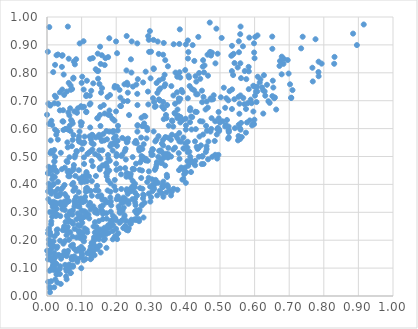
| Category | Series 0 |
|---|---|
| 0.06824700229965663 | 0.754 |
| 0.1830701874991575 | 0.353 |
| 0.2811772246203279 | 0.609 |
| 0.03949872893251938 | 0.336 |
| 0.013513308340486141 | 0.127 |
| 0.5805609430850153 | 0.691 |
| 0.2684255977533888 | 0.524 |
| 0.33551079434464426 | 0.56 |
| 0.4613237618124858 | 0.526 |
| 0.5594282554143306 | 0.596 |
| 0.015936230881952174 | 0.432 |
| 0.36609478913919913 | 0.384 |
| 0.005229981389317184 | 0.402 |
| 0.13617876414057561 | 0.211 |
| 0.0190204945127872 | 0.459 |
| 0.09884176475296524 | 0.408 |
| 0.31766599613850954 | 0.48 |
| 0.1120817068355886 | 0.374 |
| 0.3215266545365061 | 0.499 |
| 0.11395448531870145 | 0.299 |
| 0.6509886942930435 | 0.93 |
| 0.12961544246457035 | 0.412 |
| 0.25900898607874545 | 0.276 |
| 0.15515248873453558 | 0.156 |
| 0.15386628655129853 | 0.567 |
| 0.4067411714815298 | 0.516 |
| 0.09602220598651057 | 0.252 |
| 0.3145781405314173 | 0.459 |
| 0.19040139808495193 | 0.288 |
| 0.3007649762347038 | 0.876 |
| 0.7844956148613271 | 0.803 |
| 0.21088499514608583 | 0.302 |
| 0.012439027951619108 | 0.52 |
| 0.695639233063166 | 0.846 |
| 0.02204320124111081 | 0.214 |
| 0.19833497009324386 | 0.379 |
| 0.21177242997557244 | 0.681 |
| 0.05680670048457381 | 0.143 |
| 0.13990787974082763 | 0.379 |
| 0.06366160458976222 | 0.201 |
| 0.5548299941696926 | 0.874 |
| 0.6077482837482275 | 0.733 |
| 0.20954991679724588 | 0.739 |
| 0.43735292545906934 | 0.929 |
| 0.42852630509726297 | 0.66 |
| 0.5200988941397187 | 0.631 |
| 0.3361290591253796 | 0.41 |
| 0.3772609858993208 | 0.668 |
| 0.33561291336071164 | 0.696 |
| 0.22388247900074443 | 0.289 |
| 0.6308239940559905 | 0.718 |
| 0.16266515512876822 | 0.581 |
| 0.081697026464299 | 0.337 |
| 0.08227553829603818 | 0.338 |
| 0.1651942658163955 | 0.558 |
| 0.1716693177651626 | 0.222 |
| 0.15826200266414125 | 0.305 |
| 0.49590708330592104 | 0.66 |
| 0.5254547058298895 | 0.587 |
| 0.1611173163894316 | 0.295 |
| 0.18978728532721467 | 0.521 |
| 0.01963502204100509 | 0.401 |
| 0.022904042696837323 | 0.098 |
| 0.4133893953402268 | 0.623 |
| 0.057928287304938486 | 0.355 |
| 0.2516385949012927 | 0.454 |
| 0.3448040623651145 | 0.371 |
| 0.1067275963987685 | 0.196 |
| 0.011994217642718907 | 0.257 |
| 0.5993145377295892 | 0.751 |
| 0.17464963354633234 | 0.713 |
| 0.7389372572300447 | 0.929 |
| 0.15911428346599366 | 0.745 |
| 0.1725934173680994 | 0.429 |
| 0.2544721642553185 | 0.348 |
| 0.036999516548801514 | 0.097 |
| 0.10179420523171123 | 0.786 |
| 0.07244926398154428 | 0.265 |
| 0.5673173902346287 | 0.71 |
| 0.45378878852244087 | 0.801 |
| 0.09103132466671693 | 0.561 |
| 0.534562959266195 | 0.67 |
| 0.43149828598437356 | 0.769 |
| 0.5533381058271908 | 0.714 |
| 0.0747086994613474 | 0.307 |
| 0.2277823892010964 | 0.489 |
| 0.1077773991678479 | 0.41 |
| 0.2704978593562879 | 0.53 |
| 0.09052162772602856 | 0.234 |
| 0.1800290456814989 | 0.924 |
| 0.08971099720762388 | 0.254 |
| 0.8846224826055232 | 0.94 |
| 0.5343694973761695 | 0.806 |
| 0.45901625666952284 | 0.516 |
| 0.5394620513028953 | 0.868 |
| 0.12797463076417304 | 0.135 |
| 0.19582163611988468 | 0.416 |
| 0.18355029162093583 | 0.403 |
| 0.2613868529060491 | 0.684 |
| 0.0498611279947484 | 0.236 |
| 0.3958453580697351 | 0.528 |
| 0.060282389543253934 | 0.966 |
| 0.048222520248406564 | 0.794 |
| 0.4292675855977318 | 0.788 |
| 0.15023226838105275 | 0.216 |
| 0.12023103641395683 | 0.378 |
| 0.12225692437964863 | 0.515 |
| 0.1528545569412647 | 0.454 |
| 0.10164987374049583 | 0.676 |
| 0.1006480005140985 | 0.225 |
| 0.25097749966030447 | 0.397 |
| 0.22517596634446557 | 0.349 |
| 0.08195085373483468 | 0.43 |
| 0.5595049250783234 | 0.966 |
| 0.0722347280202481 | 0.626 |
| 0.039952407652258604 | 0.513 |
| 0.5986714847782346 | 0.873 |
| 0.26093512936785246 | 0.905 |
| 0.36125351934258054 | 0.629 |
| 0.5994043549654506 | 0.632 |
| 0.47131057100054474 | 0.875 |
| 0.008657417523353472 | 0.229 |
| 0.08507444343145498 | 0.21 |
| 0.10215245420312391 | 0.148 |
| 0.052686711993782165 | 0.599 |
| 0.22387320806887656 | 0.759 |
| 0.49955744955663617 | 0.622 |
| 0.31302371878940083 | 0.554 |
| 0.07933354990565844 | 0.142 |
| 0.5780549776932332 | 0.622 |
| 0.31160048101296645 | 0.678 |
| 0.19947959885254007 | 0.662 |
| 0.059561290878144546 | 0.445 |
| 0.38266058285021565 | 0.554 |
| 0.13564030322974407 | 0.202 |
| 0.06337578110452635 | 0.34 |
| 0.6785977842568344 | 0.858 |
| 0.18282876425494698 | 0.259 |
| 0.09395417792827299 | 0.589 |
| 0.3851879903616089 | 0.783 |
| 0.12557836676213385 | 0.69 |
| 0.43901208126293734 | 0.499 |
| 0.43537456775125893 | 0.723 |
| 0.21763980230334345 | 0.567 |
| 0.4523501550121589 | 0.713 |
| 0.16677073158493105 | 0.654 |
| 0.010764543044459063 | 0.558 |
| 0.22185866546062727 | 0.317 |
| 0.16133503638913416 | 0.324 |
| 0.19207148982297495 | 0.545 |
| 0.3418346939650596 | 0.759 |
| 0.20474861560081747 | 0.352 |
| 0.4284052369014043 | 0.485 |
| 0.029587092239071078 | 0.29 |
| 0.08188166345749015 | 0.505 |
| 0.16893505166892464 | 0.852 |
| 0.46488136141790926 | 0.675 |
| 0.008191597259982197 | 0.301 |
| 0.01899270890311089 | 0.106 |
| 0.45253487404511084 | 0.473 |
| 0.02891332274455871 | 0.224 |
| 0.5564487210250814 | 0.689 |
| 0.0968394567399109 | 0.342 |
| 0.028604775995269116 | 0.445 |
| 0.4253869010413215 | 0.737 |
| 0.28899921892057656 | 0.603 |
| 0.6090662876008548 | 0.786 |
| 0.02348424862243148 | 0.373 |
| 0.3385578229192113 | 0.506 |
| 0.455272377834505 | 0.826 |
| 0.039753670062191215 | 0.043 |
| 0.3136725323834063 | 0.408 |
| 0.5576511713963256 | 0.601 |
| 0.21126848088696926 | 0.457 |
| 0.3999139699988784 | 0.547 |
| 0.11310617071994966 | 0.716 |
| 0.399424643162948 | 0.81 |
| 0.04754799831796763 | 0.595 |
| 0.07149349742037692 | 0.133 |
| 0.038590806049310866 | 0.286 |
| 0.105588915844957 | 0.913 |
| 0.19521631159899244 | 0.747 |
| 0.20264341385494578 | 0.204 |
| 0.4977189184482712 | 0.591 |
| 0.39430797097548254 | 0.529 |
| 0.3611563411412537 | 0.578 |
| 0.18427706475229055 | 0.302 |
| 0.00015083269038240754 | 0.65 |
| 0.100773571525555 | 0.526 |
| 0.023310899792571282 | 0.596 |
| 0.09743799858089441 | 0.623 |
| 0.33531689206058213 | 0.391 |
| 0.07579187833100598 | 0.405 |
| 0.10198308516575605 | 0.278 |
| 0.5023664171913251 | 0.712 |
| 0.29802936256956225 | 0.392 |
| 0.10188896735229902 | 0.262 |
| 0.3451839161553236 | 0.51 |
| 0.0839099567654632 | 0.355 |
| 0.3242516531566456 | 0.773 |
| 0.3713653593978169 | 0.801 |
| 0.2004183331914342 | 0.217 |
| 0.10864978334318542 | 0.242 |
| 0.22049944693537582 | 0.244 |
| 0.32837936434123793 | 0.522 |
| 0.7850043519947243 | 0.84 |
| 0.15456722828429692 | 0.609 |
| 0.17513754700077733 | 0.451 |
| 0.12625219152828748 | 0.177 |
| 0.1408123842131923 | 0.813 |
| 0.4177013598127346 | 0.597 |
| 0.051374447865876305 | 0.325 |
| 0.138693052904036 | 0.3 |
| 0.05241586046878244 | 0.112 |
| 0.45988037742373244 | 0.61 |
| 0.5887203780079965 | 0.704 |
| 0.03243879844314068 | 0.332 |
| 0.22495912557318254 | 0.52 |
| 0.03172090971301067 | 0.866 |
| 0.04407960424496371 | 0.312 |
| 0.09236744571664901 | 0.572 |
| 0.6012244147038303 | 0.718 |
| 0.2593885608527896 | 0.307 |
| 0.14464719484505184 | 0.226 |
| 0.025976558038393383 | 0.713 |
| 0.13814014786351858 | 0.228 |
| 0.15707125635043817 | 0.355 |
| 0.5149372932353731 | 0.608 |
| 0.2603279560010002 | 0.36 |
| 0.28550728990628216 | 0.486 |
| 0.36536572617085405 | 0.719 |
| 0.007456008931928437 | 0.091 |
| 0.524980920690974 | 0.607 |
| 0.68339337696201 | 0.832 |
| 0.11396330192383275 | 0.444 |
| 0.7059644916804282 | 0.711 |
| 0.01610166321873696 | 0.328 |
| 0.2794426743781543 | 0.544 |
| 0.3879050370181828 | 0.46 |
| 0.5166995588680161 | 0.613 |
| 0.09700886651577612 | 0.349 |
| 0.09649383480118745 | 0.336 |
| 0.26123678799216565 | 0.589 |
| 0.06142903245437226 | 0.097 |
| 0.19455641725190587 | 0.275 |
| 0.06490385740716309 | 0.497 |
| 0.025627231822067165 | 0.334 |
| 0.5982873693957241 | 0.906 |
| 0.10260330267287454 | 0.281 |
| 0.2007952117442966 | 0.452 |
| 0.5962529507768168 | 0.754 |
| 0.2746921873243755 | 0.45 |
| 0.3966207150986327 | 0.45 |
| 0.1479925997104251 | 0.807 |
| 0.08668452060249765 | 0.657 |
| 0.10054907192700024 | 0.621 |
| 0.007945434103223792 | 0.033 |
| 0.5430544450167653 | 0.601 |
| 0.358651507864568 | 0.5 |
| 0.46546816528288415 | 0.49 |
| 0.44939869877589567 | 0.626 |
| 0.09956102745817486 | 0.206 |
| 0.1706379066424769 | 0.24 |
| 0.3470085527237151 | 0.684 |
| 0.3821579215872045 | 0.584 |
| 0.24088242842353413 | 0.432 |
| 0.332693939597962 | 0.679 |
| 0.127844367565232 | 0.736 |
| 0.16045897605840875 | 0.468 |
| 0.4084803926927424 | 0.874 |
| 0.1124764320729097 | 0.385 |
| 0.38381147055337317 | 0.956 |
| 0.10868055400388188 | 0.571 |
| 0.1258490187155512 | 0.132 |
| 0.0763758061290678 | 0.782 |
| 0.2533103756338395 | 0.55 |
| 0.29433643464734605 | 0.447 |
| 0.09311993776528649 | 0.321 |
| 0.10012812378704461 | 0.764 |
| 0.0031068490973011897 | 0.225 |
| 0.0235377776839083 | 0.323 |
| 0.29939992164804674 | 0.78 |
| 0.4477658637585452 | 0.736 |
| 0.22776353692757445 | 0.56 |
| 0.03913271862962997 | 0.366 |
| 0.2176906132737506 | 0.507 |
| 0.4776344737603444 | 0.499 |
| 0.6017582924854767 | 0.929 |
| 0.10359587740583087 | 0.226 |
| 0.36994888372674783 | 0.532 |
| 0.41426557344322756 | 0.673 |
| 0.14371135482239483 | 0.211 |
| 0.1466645407451137 | 0.637 |
| 0.06184871662531255 | 0.429 |
| 0.6846558682056726 | 0.85 |
| 0.0024561856715252794 | 0.876 |
| 0.22951050618111868 | 0.428 |
| 0.5980340544633178 | 0.615 |
| 0.1514666868333403 | 0.76 |
| 0.24189531331506664 | 0.438 |
| 0.20728023557017317 | 0.321 |
| 0.16397963124206105 | 0.684 |
| 0.2302396516940134 | 0.932 |
| 0.10518077826250782 | 0.2 |
| 0.2537186246725601 | 0.275 |
| 0.3298587975887284 | 0.477 |
| 0.01935766864990318 | 0.338 |
| 0.16714402956891505 | 0.205 |
| 0.19956558787444822 | 0.241 |
| 0.48615189162647743 | 0.506 |
| 0.06979664603456215 | 0.446 |
| 0.0005221446316013845 | 0.162 |
| 0.36854589580299735 | 0.656 |
| 0.14187036576598344 | 0.307 |
| 0.3043711683179695 | 0.526 |
| 0.32952042391439573 | 0.49 |
| 0.35016626725264965 | 0.567 |
| 0.035518257940128084 | 0.145 |
| 0.26638292682701503 | 0.304 |
| 0.44707467850547156 | 0.473 |
| 0.3166496488346561 | 0.561 |
| 0.41049776200239596 | 0.783 |
| 0.4011532822886341 | 0.596 |
| 0.06894336729470651 | 0.739 |
| 0.3581765977727377 | 0.56 |
| 0.13370198527782917 | 0.189 |
| 0.40184390029761774 | 0.444 |
| 0.0214273757786948 | 0.325 |
| 0.17179900955451954 | 0.173 |
| 0.3345979606999473 | 0.399 |
| 0.04420362903426944 | 0.74 |
| 0.67825689687413 | 0.795 |
| 0.07404300865532765 | 0.559 |
| 0.49206085800489885 | 0.598 |
| 0.277538639799373 | 0.35 |
| 0.021348786034781853 | 0.482 |
| 0.46401071887073175 | 0.865 |
| 0.06076338868550113 | 0.226 |
| 0.06456800272598151 | 0.113 |
| 0.34158595023806015 | 0.468 |
| 0.062194310552669 | 0.446 |
| 0.029909297944114344 | 0.048 |
| 0.49405151160351324 | 0.602 |
| 0.03785800105482129 | 0.107 |
| 0.20991870455833783 | 0.262 |
| 0.12851986443594943 | 0.144 |
| 0.0026931499207359932 | 0.441 |
| 0.09911168209205978 | 0.155 |
| 0.24751972419775403 | 0.384 |
| 0.06008998250053377 | 0.096 |
| 0.24704568796503146 | 0.347 |
| 0.27546973769783467 | 0.527 |
| 0.8309813367402479 | 0.857 |
| 0.05008178690281717 | 0.244 |
| 0.020733462822632 | 0.155 |
| 0.14536286523457542 | 0.169 |
| 0.5926269037526801 | 0.612 |
| 0.32402819063869415 | 0.739 |
| 0.15406710534095513 | 0.218 |
| 0.15675400401415884 | 0.31 |
| 0.08887543595851544 | 0.296 |
| 0.2008596654694932 | 0.509 |
| 0.30978636503811385 | 0.384 |
| 0.12434600277579055 | 0.334 |
| 0.18905073761233526 | 0.273 |
| 0.47405759991254603 | 0.862 |
| 0.04598442529145763 | 0.145 |
| 0.051423476318921635 | 0.46 |
| 0.12428112790544465 | 0.165 |
| 0.2296594886630069 | 0.808 |
| 0.04711064592956815 | 0.625 |
| 0.4281839401443912 | 0.469 |
| 0.5628748999451171 | 0.57 |
| 0.24481958493987432 | 0.912 |
| 0.04655570352494176 | 0.666 |
| 0.22391799397048617 | 0.285 |
| 0.27898806200563353 | 0.281 |
| 0.09327594198008726 | 0.421 |
| 0.3085690890782641 | 0.813 |
| 0.021964676339643496 | 0.301 |
| 0.24902774060201738 | 0.456 |
| 0.18917037596670616 | 0.635 |
| 0.10767774915973705 | 0.55 |
| 0.33502949826721184 | 0.779 |
| 0.08480545934062989 | 0.274 |
| 0.35936065806220296 | 0.752 |
| 0.094465270451903 | 0.905 |
| 0.06088116862142112 | 0.162 |
| 0.1099880287148064 | 0.341 |
| 0.1345935463294573 | 0.249 |
| 0.5419215696697052 | 0.835 |
| 0.4384438992531987 | 0.532 |
| 0.5608731136048677 | 0.62 |
| 0.0214341786565162 | 0.482 |
| 0.33154660463507113 | 0.369 |
| 0.14982929462450512 | 0.269 |
| 0.3275811350309321 | 0.744 |
| 0.3422299145967581 | 0.57 |
| 0.20522873618853177 | 0.348 |
| 0.022467073643641533 | 0.426 |
| 0.015734358819027294 | 0.103 |
| 0.04948246525526456 | 0.721 |
| 0.49743920369111616 | 0.597 |
| 0.06693399942021605 | 0.673 |
| 0.2528798236409415 | 0.273 |
| 0.07552973792330031 | 0.132 |
| 0.027274209104811487 | 0.078 |
| 0.07154820835942133 | 0.131 |
| 0.031181623376824397 | 0.383 |
| 0.5847204478045978 | 0.926 |
| 0.3830215471682241 | 0.802 |
| 0.03173951309323686 | 0.409 |
| 0.37644700463962155 | 0.786 |
| 0.13127257731508568 | 0.525 |
| 0.10327637385962662 | 0.303 |
| 0.5827683786903678 | 0.821 |
| 0.0680782518023687 | 0.591 |
| 0.514956625236158 | 0.674 |
| 0.08087883586635536 | 0.33 |
| 0.09966332342558237 | 0.307 |
| 0.02793475640227039 | 0.172 |
| 0.04561192849789386 | 0.236 |
| 0.2257829158366762 | 0.251 |
| 0.27382558096476006 | 0.325 |
| 0.3417794968610596 | 0.845 |
| 0.16021014901131336 | 0.303 |
| 0.3772278614906026 | 0.565 |
| 0.1552276265090502 | 0.832 |
| 0.13257389844062362 | 0.154 |
| 0.09824141993186408 | 0.68 |
| 0.11180056713312214 | 0.285 |
| 0.34623423477970594 | 0.434 |
| 0.29016367532146603 | 0.594 |
| 0.06331311600577216 | 0.448 |
| 0.12204582246893192 | 0.278 |
| 0.6358004572582457 | 0.757 |
| 0.07547756536742634 | 0.105 |
| 0.47670746466215663 | 0.872 |
| 0.11124854984476107 | 0.133 |
| 0.2573508667332457 | 0.474 |
| 0.349701449662549 | 0.392 |
| 0.05886799661068942 | 0.551 |
| 0.19867625633845531 | 0.208 |
| 0.026389370524434352 | 0.116 |
| 0.14141160001452624 | 0.568 |
| 0.23555618908692688 | 0.34 |
| 0.07261380233164971 | 0.4 |
| 0.009967958485296635 | 0.337 |
| 0.1385084942022432 | 0.265 |
| 0.318958562432028 | 0.728 |
| 0.024051265069297112 | 0.059 |
| 0.057278542631441054 | 0.733 |
| 0.18563099186146215 | 0.546 |
| 0.0498879297519379 | 0.338 |
| 0.15853503926999968 | 0.863 |
| 0.3830161462529452 | 0.492 |
| 0.0914914780008047 | 0.372 |
| 0.025737821346734968 | 0.287 |
| 0.9154318183329784 | 0.973 |
| 0.007868275587523232 | 0.388 |
| 0.4616398535826288 | 0.697 |
| 0.26894833478779867 | 0.387 |
| 0.10726353643271247 | 0.473 |
| 0.48607397839713595 | 0.626 |
| 0.12337040799916077 | 0.686 |
| 0.1844949667906458 | 0.339 |
| 0.09196609897743324 | 0.451 |
| 0.5414833811156791 | 0.705 |
| 0.1772993676231127 | 0.493 |
| 0.17630422463504847 | 0.245 |
| 0.3494571926993034 | 0.823 |
| 0.291782708598735 | 0.733 |
| 0.058350896950246534 | 0.336 |
| 0.027958175857930034 | 0.292 |
| 0.43535643009607916 | 0.527 |
| 0.100916916808105 | 0.347 |
| 0.1716936961889557 | 0.591 |
| 0.17268797943185188 | 0.464 |
| 0.2936919509053666 | 0.423 |
| 0.23907029736844698 | 0.382 |
| 0.10577779683375033 | 0.547 |
| 0.34550644097971606 | 0.637 |
| 0.5540321956184917 | 0.614 |
| 0.3329584206242001 | 0.515 |
| 0.5760485395886668 | 0.777 |
| 0.13369240474354627 | 0.762 |
| 0.020810776389173835 | 0.523 |
| 0.1059409866392389 | 0.415 |
| 0.7344945650486575 | 0.888 |
| 0.38521214891860844 | 0.622 |
| 0.2821174989940023 | 0.334 |
| 0.04344654218828625 | 0.861 |
| 0.07929466408040209 | 0.321 |
| 0.09868105014095552 | 0.176 |
| 0.0039430406412531704 | 0.347 |
| 0.18272812036489783 | 0.537 |
| 0.0646066320385571 | 0.648 |
| 0.12472691632333 | 0.85 |
| 0.08911375123089715 | 0.164 |
| 0.07679867570478449 | 0.458 |
| 0.1414616469335378 | 0.43 |
| 0.23024393160391055 | 0.44 |
| 0.29139589714281877 | 0.485 |
| 0.5715697852397332 | 0.806 |
| 0.4664030626083471 | 0.554 |
| 0.2624980814578475 | 0.777 |
| 0.10176315920961532 | 0.344 |
| 0.19612621763513471 | 0.753 |
| 0.2183251942880312 | 0.306 |
| 0.4091790205317738 | 0.79 |
| 0.1323994259462533 | 0.466 |
| 0.15272163519031134 | 0.181 |
| 0.5183808677257425 | 0.709 |
| 0.4119604851892895 | 0.477 |
| 0.27599031839925336 | 0.384 |
| 0.09169543702215388 | 0.28 |
| 0.33181122647270866 | 0.547 |
| 0.21483102819230449 | 0.269 |
| 0.01565613779950703 | 0.451 |
| 0.5237506437463733 | 0.564 |
| 0.0034811446033661264 | 0.44 |
| 0.27311053086530024 | 0.502 |
| 0.23285846053293568 | 0.699 |
| 0.25685930615861785 | 0.556 |
| 0.3076800192921697 | 0.918 |
| 0.38077548513717674 | 0.512 |
| 0.21403530504474388 | 0.436 |
| 0.2544953525044762 | 0.37 |
| 0.1818900357655927 | 0.246 |
| 0.31675139840754607 | 0.763 |
| 0.06471028043907989 | 0.295 |
| 0.21040055523338985 | 0.298 |
| 0.10751985336255743 | 0.211 |
| 0.1530776563151227 | 0.649 |
| 0.1198116924309427 | 0.291 |
| 0.5379316029011697 | 0.792 |
| 0.028134150233110056 | 0.236 |
| 0.30957357164149657 | 0.695 |
| 0.011910800227780571 | 0.169 |
| 0.231198589605619 | 0.376 |
| 0.06941047322986149 | 0.18 |
| 0.0500222621602846 | 0.16 |
| 0.3919369724065328 | 0.73 |
| 0.33708874394628496 | 0.495 |
| 0.37710796800114066 | 0.381 |
| 0.6586866287487936 | 0.712 |
| 0.22066103257837255 | 0.353 |
| 0.15471413896127872 | 0.678 |
| 0.28433600155455563 | 0.488 |
| 0.24288590246328434 | 0.268 |
| 0.12911507156396862 | 0.484 |
| 0.44921017236737826 | 0.5 |
| 0.22725198445687134 | 0.527 |
| 0.3053614696512258 | 0.506 |
| 0.2682037498271339 | 0.531 |
| 0.1803583526090845 | 0.665 |
| 0.047304202800513284 | 0.188 |
| 0.13676877233128004 | 0.166 |
| 0.2721824443473564 | 0.568 |
| 0.23718462793031447 | 0.649 |
| 0.33743812576041443 | 0.907 |
| 0.19992651391557692 | 0.474 |
| 0.12388781889236067 | 0.159 |
| 0.14501658819315077 | 0.241 |
| 0.32576294320125454 | 0.377 |
| 0.013802153840372311 | 0.179 |
| 0.1545105444834065 | 0.493 |
| 0.004047374524346559 | 0.236 |
| 0.39647524511812493 | 0.436 |
| 0.14468354654259352 | 0.395 |
| 0.022683513377483533 | 0.718 |
| 0.006635736686724569 | 0.964 |
| 0.059783449213340556 | 0.248 |
| 0.5582159599155873 | 0.563 |
| 0.2167953666035194 | 0.34 |
| 0.09935217093802184 | 0.14 |
| 0.2341858910765735 | 0.235 |
| 0.3230143734346266 | 0.868 |
| 0.28757194512961515 | 0.565 |
| 0.06862468836224778 | 0.083 |
| 0.40153497719850617 | 0.612 |
| 0.2950996329197566 | 0.875 |
| 0.19487341071979702 | 0.549 |
| 0.23328621070781264 | 0.366 |
| 0.5859120053884752 | 0.629 |
| 0.06689116331385403 | 0.297 |
| 0.17064495034909355 | 0.335 |
| 0.00951996204613248 | 0.683 |
| 0.6248354889637765 | 0.737 |
| 0.011826564668535045 | 0.377 |
| 0.1766581696274253 | 0.856 |
| 0.05998757485913098 | 0.533 |
| 0.4257942793691921 | 0.843 |
| 0.13976744751058656 | 0.309 |
| 0.17996761748952372 | 0.45 |
| 0.38869974324463985 | 0.739 |
| 0.11169435166419939 | 0.427 |
| 0.27957372192445995 | 0.361 |
| 0.40680992400917704 | 0.553 |
| 0.48680685857908546 | 0.834 |
| 0.31390145751464993 | 0.416 |
| 0.5913342961932558 | 0.691 |
| 0.019299126523410814 | 0.179 |
| 0.17136673478074682 | 0.441 |
| 0.41867245778542084 | 0.742 |
| 0.037310201416982824 | 0.73 |
| 0.709491932647244 | 0.738 |
| 0.20445989045258894 | 0.593 |
| 0.05499144936682887 | 0.097 |
| 0.05525902003247807 | 0.07 |
| 0.23551361083177458 | 0.331 |
| 0.09647144610316405 | 0.229 |
| 0.3363466821359917 | 0.356 |
| 0.0864203062579304 | 0.518 |
| 0.015096874717155706 | 0.419 |
| 0.48960452891435613 | 0.958 |
| 0.3469916985228245 | 0.426 |
| 0.1486706991115362 | 0.377 |
| 0.1489324235364209 | 0.502 |
| 0.07496767450415565 | 0.109 |
| 0.04542809820466975 | 0.389 |
| 0.1857376791678803 | 0.325 |
| 0.6149847843756306 | 0.766 |
| 0.13418226857740823 | 0.183 |
| 0.2559175303872715 | 0.326 |
| 0.07767097627139086 | 0.469 |
| 0.21855088385389254 | 0.273 |
| 0.5607644739859561 | 0.781 |
| 0.43264667266681556 | 0.534 |
| 0.4301609819668881 | 0.598 |
| 0.11388577528548915 | 0.661 |
| 0.2582407384276413 | 0.758 |
| 0.13757982047569317 | 0.146 |
| 0.1717635613322146 | 0.475 |
| 0.06325784355363107 | 0.441 |
| 0.10355121538877676 | 0.428 |
| 0.3438429746745072 | 0.649 |
| 0.3356437499703874 | 0.865 |
| 0.07189554837346124 | 0.537 |
| 0.04085322536402303 | 0.134 |
| 0.018461695557840163 | 0.12 |
| 0.32396628128093785 | 0.52 |
| 0.06727188366649528 | 0.229 |
| 0.1288970312031329 | 0.549 |
| 0.3475870909328399 | 0.398 |
| 0.37582206715468114 | 0.73 |
| 0.4406789350492373 | 0.572 |
| 0.14338554005017057 | 0.248 |
| 0.6568229523158794 | 0.709 |
| 0.18749142124893314 | 0.266 |
| 0.6525513685943345 | 0.772 |
| 0.014939214548216784 | 0.284 |
| 0.19032412686366307 | 0.588 |
| 0.037188545389090444 | 0.079 |
| 0.43966121199286046 | 0.799 |
| 0.013223560122144984 | 0.136 |
| 0.2335949184772078 | 0.729 |
| 0.48177378288796535 | 0.719 |
| 0.7760380129409502 | 0.92 |
| 0.07259691986464367 | 0.742 |
| 0.07088076504475604 | 0.303 |
| 0.05917925648787348 | 0.48 |
| 0.16274696206204642 | 0.228 |
| 0.07507864608686965 | 0.184 |
| 0.26547160395638025 | 0.276 |
| 0.5591888757650515 | 0.719 |
| 0.015713070559850717 | 0.397 |
| 0.2852138220352213 | 0.804 |
| 0.5275558443348123 | 0.734 |
| 0.17882306898914868 | 0.227 |
| 0.2546144200827962 | 0.304 |
| 0.17817912348910048 | 0.336 |
| 0.02755828919757075 | 0.312 |
| 0.5999196706433922 | 0.852 |
| 0.5048430959085087 | 0.925 |
| 0.1763444150993102 | 0.253 |
| 0.4430042973804761 | 0.778 |
| 0.3651385194563691 | 0.525 |
| 0.1751211680201339 | 0.378 |
| 0.05926422744443405 | 0.282 |
| 0.35360612983649276 | 0.378 |
| 0.14282404270386018 | 0.177 |
| 0.11670225993360284 | 0.509 |
| 0.08046693457308618 | 0.345 |
| 0.03000919041408856 | 0.177 |
| 0.39869460249217015 | 0.46 |
| 0.03123795178603761 | 0.358 |
| 0.10690223394578557 | 0.497 |
| 0.05625920672563256 | 0.599 |
| 0.005744502786495964 | 0.187 |
| 0.18433577328470518 | 0.269 |
| 0.08104713235874916 | 0.338 |
| 0.1147878062293628 | 0.237 |
| 0.4723960913901918 | 0.589 |
| 0.3200315332343213 | 0.912 |
| 0.24396308860114124 | 0.273 |
| 0.12163460244710878 | 0.428 |
| 0.09267455286086712 | 0.553 |
| 0.1916204603513928 | 0.591 |
| 0.17701932961649758 | 0.65 |
| 0.11439076589742025 | 0.721 |
| 0.17383973901181105 | 0.44 |
| 0.4069663974920924 | 0.916 |
| 0.4610893804965981 | 0.537 |
| 0.18343087651985135 | 0.374 |
| 0.19979898416613173 | 0.272 |
| 0.05159112007833089 | 0.308 |
| 0.2011104062783351 | 0.347 |
| 0.15981792358589475 | 0.345 |
| 0.3505546842504732 | 0.531 |
| 0.2660341296578804 | 0.268 |
| 0.507097076701096 | 0.626 |
| 0.8956449033073955 | 0.899 |
| 0.0032001121327925874 | 0.375 |
| 0.0158574833074413 | 0.512 |
| 0.15115512469248693 | 0.522 |
| 0.14664363749790954 | 0.869 |
| 0.27564627281230325 | 0.328 |
| 0.37969936713140373 | 0.646 |
| 0.17345491357739262 | 0.562 |
| 0.2123258158121133 | 0.711 |
| 0.2784373079538711 | 0.497 |
| 0.19848195120524748 | 0.573 |
| 0.2660772375082816 | 0.527 |
| 0.1295595755126706 | 0.359 |
| 0.028501694429239555 | 0.091 |
| 0.38157592520635375 | 0.451 |
| 0.05660193517843248 | 0.483 |
| 0.2023178417793009 | 0.538 |
| 0.19598203974675354 | 0.213 |
| 0.17251163468331832 | 0.277 |
| 0.01188132101868311 | 0.053 |
| 0.5964475017861324 | 0.661 |
| 0.24068194637836726 | 0.425 |
| 0.2587821286447952 | 0.273 |
| 0.061601289116898994 | 0.658 |
| 0.25428061422996984 | 0.402 |
| 0.49312086482326467 | 0.868 |
| 0.0061489214828419625 | 0.242 |
| 0.37656614012973677 | 0.638 |
| 0.15685821371650233 | 0.361 |
| 0.534932096139213 | 0.863 |
| 0.15342930351835438 | 0.894 |
| 0.2723053094410429 | 0.423 |
| 0.15056727516878 | 0.578 |
| 0.09420536789976586 | 0.209 |
| 0.010298048197590948 | 0.219 |
| 0.15502676495934897 | 0.32 |
| 0.04086483046327527 | 0.382 |
| 0.1346703105797833 | 0.544 |
| 0.037787274772626445 | 0.198 |
| 0.009229136923756598 | 0.153 |
| 0.1452605127621518 | 0.807 |
| 0.30211004409644493 | 0.506 |
| 0.06974733082565754 | 0.631 |
| 0.33300383366866737 | 0.392 |
| 0.5240885991230054 | 0.701 |
| 0.2615407977026625 | 0.611 |
| 0.43129092850042505 | 0.723 |
| 0.0665427896239652 | 0.302 |
| 0.22800051540892152 | 0.27 |
| 0.06836773985011813 | 0.295 |
| 0.08958181888564687 | 0.132 |
| 0.3063389722342311 | 0.525 |
| 0.10603080131410625 | 0.74 |
| 0.5588526320478862 | 0.834 |
| 0.4848162256733968 | 0.556 |
| 0.4013187023331053 | 0.406 |
| 0.14520337487157386 | 0.296 |
| 0.554365087246432 | 0.913 |
| 0.4196806968225034 | 0.641 |
| 0.1477466479115479 | 0.779 |
| 0.12015090468589351 | 0.325 |
| 0.11532227043640586 | 0.772 |
| 0.06565413235450224 | 0.429 |
| 0.2025517482420317 | 0.87 |
| 0.13404282607450413 | 0.321 |
| 0.21470398491366338 | 0.383 |
| 0.23419791339952079 | 0.564 |
| 0.6398881252680367 | 0.698 |
| 0.03140519152981691 | 0.561 |
| 0.4115557794191931 | 0.517 |
| 0.12280973719954402 | 0.572 |
| 0.5750249744277235 | 0.585 |
| 0.24764648073416928 | 0.456 |
| 0.552092751424578 | 0.558 |
| 0.1523468439432567 | 0.46 |
| 0.004228010709672603 | 0.148 |
| 0.4449228290638154 | 0.54 |
| 0.3263935917077754 | 0.701 |
| 0.7937516473710551 | 0.833 |
| 0.11018510101341539 | 0.355 |
| 0.5511748693232964 | 0.819 |
| 0.4953787334404163 | 0.506 |
| 0.22722255518012624 | 0.249 |
| 0.6983299580631945 | 0.797 |
| 0.2927987346655432 | 0.687 |
| 0.49074148452611854 | 0.579 |
| 0.5706024436779166 | 0.688 |
| 0.4071142609354521 | 0.709 |
| 0.1660754909495038 | 0.245 |
| 0.21523449011495477 | 0.501 |
| 0.10459924455390113 | 0.168 |
| 0.23637626323344507 | 0.242 |
| 0.1971016839315748 | 0.279 |
| 0.07645070232848783 | 0.453 |
| 0.023657246926638398 | 0.138 |
| 0.06574899489741359 | 0.269 |
| 0.17075079719713226 | 0.468 |
| 0.3604846160041627 | 0.374 |
| 0.5346214088290738 | 0.897 |
| 0.24758786836360336 | 0.498 |
| 0.3207940103979693 | 0.406 |
| 0.029376814578881638 | 0.589 |
| 0.20601157993274855 | 0.225 |
| 0.08472431515493783 | 0.162 |
| 0.04485619562607257 | 0.626 |
| 0.5349209186342229 | 0.741 |
| 0.12383804065631188 | 0.718 |
| 0.3506765506084236 | 0.508 |
| 0.0449754889977948 | 0.863 |
| 0.06278397877663278 | 0.85 |
| 0.12863347164586136 | 0.19 |
| 0.5251095133501468 | 0.592 |
| 0.24270243709347872 | 0.376 |
| 0.2425212689493681 | 0.259 |
| 0.2755479595087629 | 0.609 |
| 0.2674320096041548 | 0.309 |
| 0.2778846699283706 | 0.765 |
| 0.30463984087833307 | 0.375 |
| 0.08057287210512476 | 0.83 |
| 0.07969164249666816 | 0.24 |
| 0.017472280805968632 | 0.111 |
| 0.6735242052222802 | 0.842 |
| 0.38076930505829 | 0.697 |
| 0.6215083505623901 | 0.748 |
| 0.28075960533948074 | 0.618 |
| 0.03317273926616959 | 0.147 |
| 0.10216310965512898 | 0.21 |
| 0.1609576385934819 | 0.217 |
| 0.025852704079869615 | 0.45 |
| 0.12339419088839043 | 0.152 |
| 0.7850624472604246 | 0.788 |
| 0.3012060263918783 | 0.515 |
| 0.45112550114189287 | 0.845 |
| 0.2593817940402844 | 0.547 |
| 0.5560103447679171 | 0.653 |
| 0.10632715235609091 | 0.128 |
| 0.5663299448936542 | 0.895 |
| 0.061808480600009985 | 0.596 |
| 0.3699999269838674 | 0.689 |
| 0.12997805486485747 | 0.578 |
| 0.1934243569393017 | 0.565 |
| 0.21586563423657856 | 0.333 |
| 0.022237135819807796 | 0.114 |
| 0.11445465287839152 | 0.441 |
| 0.13158403462952062 | 0.576 |
| 0.00854022302689006 | 0.026 |
| 0.558418006476618 | 0.938 |
| 0.065749544934262 | 0.61 |
| 0.08002273405071048 | 0.497 |
| 0.05741536007111503 | 0.288 |
| 0.23914871276061966 | 0.262 |
| 0.10007288289498129 | 0.549 |
| 0.5110271001806909 | 0.747 |
| 0.37917138401307393 | 0.791 |
| 0.33174637477003044 | 0.477 |
| 0.1995734970232933 | 0.912 |
| 0.01794986486777539 | 0.802 |
| 0.07522713112876522 | 0.259 |
| 0.053654408443645885 | 0.265 |
| 0.6541092922428373 | 0.747 |
| 0.3036154325363638 | 0.418 |
| 0.6512754680442497 | 0.886 |
| 0.3099546963709543 | 0.398 |
| 0.3519602051110844 | 0.61 |
| 0.47562592760027966 | 0.637 |
| 0.3706927560476625 | 0.653 |
| 0.6290777035201656 | 0.733 |
| 0.294165432087216 | 0.918 |
| 0.008594143762430173 | 0.013 |
| 0.1323023954583744 | 0.853 |
| 0.16141975218626203 | 0.276 |
| 0.20264191739022497 | 0.75 |
| 0.02616732673700395 | 0.115 |
| 0.1263339938118857 | 0.311 |
| 0.3222638611101405 | 0.573 |
| 0.003897913138877551 | 0.689 |
| 0.06890954009206018 | 0.104 |
| 0.04308358433969428 | 0.821 |
| 0.23278064732379955 | 0.554 |
| 0.007965061960907294 | 0.448 |
| 0.24497929325518275 | 0.39 |
| 0.01880292719726684 | 0.093 |
| 0.1583346928653533 | 0.556 |
| 0.44260566159608317 | 0.626 |
| 0.39132031926679967 | 0.417 |
| 0.2810119499622955 | 0.646 |
| 0.01946880266166917 | 0.127 |
| 0.1084941807824179 | 0.304 |
| 0.07733175890642552 | 0.84 |
| 0.20433543529326204 | 0.557 |
| 0.05711101292734533 | 0.239 |
| 0.005203976165830015 | 0.463 |
| 0.8300510238468555 | 0.832 |
| 0.40581555830515026 | 0.532 |
| 0.3836886071741781 | 0.636 |
| 0.3876683793619896 | 0.553 |
| 0.3649086236915805 | 0.607 |
| 0.10872564289785913 | 0.286 |
| 0.08195598615618638 | 0.388 |
| 0.38094246549624766 | 0.708 |
| 0.05230143742086202 | 0.197 |
| 0.09558299204750087 | 0.288 |
| 0.10388949648016976 | 0.336 |
| 0.01318791729414115 | 0.334 |
| 0.05867761489853629 | 0.154 |
| 0.47273666096915967 | 0.708 |
| 0.12490064726414352 | 0.604 |
| 0.014198726756574076 | 0.195 |
| 0.07379701011257522 | 0.213 |
| 0.009554037008652982 | 0.512 |
| 0.40127239153976757 | 0.902 |
| 0.7055562199092666 | 0.71 |
| 0.3852682490378111 | 0.707 |
| 0.11620105442177364 | 0.153 |
| 0.3184167155620594 | 0.361 |
| 0.47493976450714004 | 0.704 |
| 0.020037879586954577 | 0.463 |
| 0.19443589443862064 | 0.393 |
| 0.014953570740951938 | 0.613 |
| 0.43266518185073755 | 0.66 |
| 0.38239107300957975 | 0.903 |
| 0.2853257610246127 | 0.492 |
| 0.48008837914661473 | 0.705 |
| 0.11578426628853045 | 0.387 |
| 0.023347100789018138 | 0.828 |
| 0.03712662811169498 | 0.665 |
| 0.6513220869445253 | 0.717 |
| 0.030467169608690114 | 0.239 |
| 0.4747814759589243 | 0.599 |
| 0.31172168351163465 | 0.452 |
| 0.273792132939791 | 0.489 |
| 0.128036292967037 | 0.52 |
| 0.25948341955556153 | 0.295 |
| 0.14726731956231065 | 0.357 |
| 0.3622989714713015 | 0.626 |
| 0.12077560349824334 | 0.155 |
| 0.6169052528296354 | 0.777 |
| 0.1272098128787723 | 0.561 |
| 0.1278260345185006 | 0.165 |
| 0.4162427434227818 | 0.444 |
| 0.29250368060639476 | 0.932 |
| 0.05072261815683066 | 0.398 |
| 0.02746007015886498 | 0.863 |
| 0.07429280252738923 | 0.619 |
| 0.41327972409373004 | 0.666 |
| 0.0782778113025141 | 0.17 |
| 0.089227763668419 | 0.673 |
| 0.012633711458587604 | 0.367 |
| 0.27322456775138904 | 0.639 |
| 0.05419383341724393 | 0.338 |
| 0.0522909432851516 | 0.157 |
| 0.2974362276580973 | 0.949 |
| 0.013137254106358132 | 0.132 |
| 0.11325667295214126 | 0.659 |
| 0.2311409132634582 | 0.764 |
| 0.04272399565612117 | 0.323 |
| 0.33788457044226594 | 0.671 |
| 0.23346993143892447 | 0.757 |
| 0.5251554467534894 | 0.595 |
| 0.4484140666948101 | 0.695 |
| 0.2430081368355358 | 0.269 |
| 0.25471978830622843 | 0.335 |
| 0.005281182544786267 | 0.202 |
| 0.5751197156672535 | 0.67 |
| 0.16416674580548762 | 0.468 |
| 0.11570927024814914 | 0.412 |
| 0.24255015001277302 | 0.848 |
| 0.17637659206167022 | 0.505 |
| 0.45833689518421683 | 0.669 |
| 0.11327901900695647 | 0.435 |
| 0.21384712406432205 | 0.681 |
| 0.625028439119235 | 0.654 |
| 0.4140801555016943 | 0.499 |
| 0.012684455810493933 | 0.628 |
| 0.3390520002042343 | 0.752 |
| 0.17168468005092508 | 0.297 |
| 0.12616891245847528 | 0.377 |
| 0.023397487199931843 | 0.498 |
| 0.056292603611022285 | 0.218 |
| 0.1950906455434449 | 0.629 |
| 0.16764390190757716 | 0.345 |
| 0.3494322272596512 | 0.496 |
| 0.6069926049952671 | 0.75 |
| 0.7670398233117869 | 0.818 |
| 0.3005978552372425 | 0.354 |
| 0.2537250512717627 | 0.39 |
| 0.021474688678492115 | 0.691 |
| 0.060095320311498224 | 0.109 |
| 0.3816574211115994 | 0.707 |
| 0.10683352790513068 | 0.678 |
| 0.25923297889553465 | 0.3 |
| 0.40112947179336833 | 0.635 |
| 0.19011328070261013 | 0.203 |
| 0.00907261150993599 | 0.685 |
| 0.0761189891113222 | 0.779 |
| 0.056415832765910445 | 0.09 |
| 0.15491009980169723 | 0.238 |
| 0.08421410361429205 | 0.849 |
| 0.06282836562929583 | 0.764 |
| 0.003118492085456115 | 0.131 |
| 0.18993915196898958 | 0.232 |
| 0.09080007965987524 | 0.169 |
| 0.0035131652207816 | 0.051 |
| 0.3063901290332104 | 0.709 |
| 0.3585749166233926 | 0.36 |
| 0.2477926918629142 | 0.412 |
| 0.6719042987296672 | 0.825 |
| 0.5971929203345372 | 0.617 |
| 0.2940626244248239 | 0.367 |
| 0.042906309318514135 | 0.454 |
| 0.06850728667805639 | 0.082 |
| 0.08800736944461307 | 0.123 |
| 0.7024241195175073 | 0.759 |
| 0.04968903520956147 | 0.151 |
| 0.5831524195730814 | 0.741 |
| 0.02044831131701541 | 0.14 |
| 0.156181869419325 | 0.729 |
| 0.4058504571206094 | 0.484 |
| 0.03582128444389643 | 0.36 |
| 0.4963313580391836 | 0.637 |
| 0.18140614836027102 | 0.485 |
| 0.015245253951353233 | 0.301 |
| 0.26774187030506214 | 0.452 |
| 0.1599525648422323 | 0.522 |
| 0.06352464442243255 | 0.267 |
| 0.16669770164817377 | 0.828 |
| 0.0982276289963454 | 0.273 |
| 0.14860193085551687 | 0.177 |
| 0.0986632758511723 | 0.611 |
| 0.28970860841243185 | 0.409 |
| 0.30812025102611273 | 0.816 |
| 0.07618445532507045 | 0.377 |
| 0.41570335707141204 | 0.486 |
| 0.23213341441136093 | 0.439 |
| 0.23082591355271342 | 0.551 |
| 0.011770257485862357 | 0.095 |
| 0.17997201693063836 | 0.589 |
| 0.19062330321266607 | 0.254 |
| 0.45127958878831587 | 0.579 |
| 0.4083058101150704 | 0.467 |
| 0.45009729526472453 | 0.822 |
| 0.3661065785797908 | 0.902 |
| 0.22355652945134774 | 0.338 |
| 0.1391607766892764 | 0.508 |
| 0.2670529557276472 | 0.521 |
| 0.22926630944607918 | 0.237 |
| 0.38605838673799653 | 0.641 |
| 0.4209562137948444 | 0.899 |
| 0.6624049344114386 | 0.668 |
| 0.4073674321602122 | 0.851 |
| 0.6083143656519095 | 0.934 |
| 0.30824612014341923 | 0.59 |
| 0.7681730472093132 | 0.769 |
| 0.3733114924000752 | 0.574 |
| 0.020833842147391257 | 0.031 |
| 0.31651203776939674 | 0.47 |
| 0.15010702230925443 | 0.204 |
| 0.4623266501596188 | 0.592 |
| 0.5536102062110465 | 0.573 |
| 0.00593334664115841 | 0.617 |
| 0.05668083715068628 | 0.06 |
| 0.5253058791620822 | 0.569 |
| 0.20100824887350677 | 0.501 |
| 0.04948152625194091 | 0.249 |
| 0.6055357116495249 | 0.695 |
| 0.47036858972426554 | 0.98 |
| 0.4121828314439615 | 0.752 |
| 0.2695259482525705 | 0.479 |
| 0.0936071030848552 | 0.224 |
| 0.05163007498314853 | 0.365 |
| 0.08957638725395778 | 0.321 |
| 0.6435349857709337 | 0.692 |
| 0.1759432739434731 | 0.415 |
| 0.07915297092222451 | 0.661 |
| 0.028615504529913904 | 0.077 |
| 0.3232448810126327 | 0.705 |
| 0.31429881117147596 | 0.68 |
| 0.16422465561658817 | 0.2 |
| 0.6037662775446136 | 0.732 |
| 0.07145388494744997 | 0.14 |
| 0.09946583319658509 | 0.169 |
| 0.137471826962837 | 0.201 |
| 0.03188906415785642 | 0.689 |
| 0.46527432863918783 | 0.79 |
| 0.2303387717172356 | 0.383 |
| 0.5326303938982441 | 0.861 |
| 0.22589981017942462 | 0.459 |
| 0.3360487221558518 | 0.539 |
| 0.24404946712008413 | 0.801 |
| 0.07650884262592894 | 0.577 |
| 0.6269471070659033 | 0.791 |
| 0.018942173102208804 | 0.196 |
| 0.4918077748208717 | 0.493 |
| 0.20485213363622656 | 0.357 |
| 0.07356956385251534 | 0.291 |
| 0.027083045783284243 | 0.359 |
| 0.07977411576086901 | 0.384 |
| 0.26092004466267404 | 0.725 |
| 0.39430809365959807 | 0.568 |
| 0.44904396850760797 | 0.501 |
| 0.20919766402552142 | 0.313 |
| 0.18200269387130852 | 0.72 |
| 0.1823784133043288 | 0.647 |
| 0.28415326120440165 | 0.644 |
| 0.39156373822183066 | 0.63 |
| 0.42769154682559063 | 0.554 |
| 0.24839131895812172 | 0.75 |
| 0.20519856987021456 | 0.61 |
| 0.42433793872682224 | 0.475 |
| 0.3940786124509805 | 0.42 |
| 0.27787599421377907 | 0.363 |
| 0.09908701890061478 | 0.1 |
| 0.026807164232983238 | 0.578 |
| 0.33742722873998243 | 0.634 |
| 0.012468722742342675 | 0.267 |
| 0.3060604092132879 | 0.399 |
| 0.08507005007916935 | 0.519 |
| 0.26183603094774976 | 0.612 |
| 0.4167770937377059 | 0.643 |
| 0.29864763550674034 | 0.338 |
| 0.22127105773092004 | 0.698 |
| 0.1473532896777503 | 0.23 |
| 0.33998787357940063 | 0.793 |
| 0.1454004389731689 | 0.638 |
| 0.11641901023320367 | 0.228 |
| 0.016493896416788223 | 0.319 |
| 0.5832219098157642 | 0.805 |